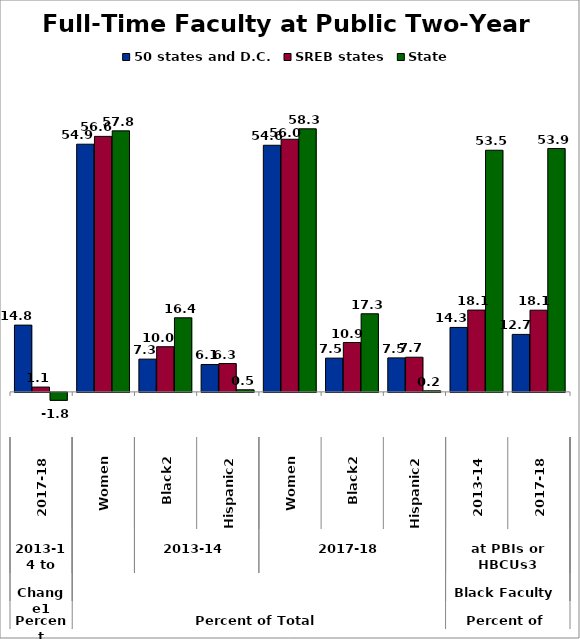
| Category | 50 states and D.C. | SREB states | State |
|---|---|---|---|
| 0 | 14.794 | 1.066 | -1.761 |
| 1 | 54.884 | 56.619 | 57.841 |
| 2 | 7.259 | 10.004 | 16.414 |
| 3 | 6.069 | 6.279 | 0.466 |
| 4 | 54.65 | 55.981 | 58.3 |
| 5 | 7.481 | 10.939 | 17.307 |
| 6 | 7.529 | 7.678 | 0.236 |
| 7 | 14.282 | 18.124 | 53.546 |
| 8 | 12.738 | 18.099 | 53.925 |